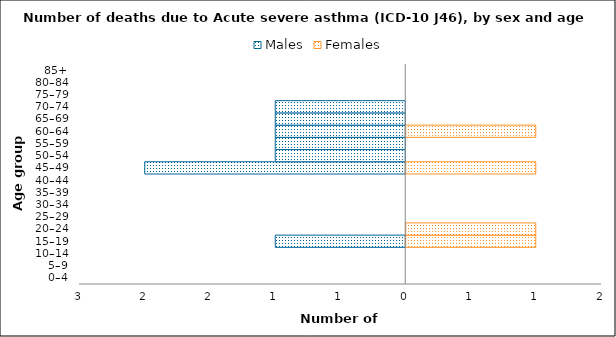
| Category | Males | Females |
|---|---|---|
| 0–4 | 0 | 0 |
| 5–9 | 0 | 0 |
| 10–14 | 0 | 0 |
| 15–19 | -1 | 1 |
| 20–24 | 0 | 1 |
| 25–29 | 0 | 0 |
| 30–34 | 0 | 0 |
| 35–39 | 0 | 0 |
| 40–44 | 0 | 0 |
| 45–49 | -2 | 1 |
| 50–54 | -1 | 0 |
| 55–59 | -1 | 0 |
| 60–64 | -1 | 1 |
| 65–69 | -1 | 0 |
| 70–74 | -1 | 0 |
| 75–79 | 0 | 0 |
| 80–84 | 0 | 0 |
| 85+ | 0 | 0 |